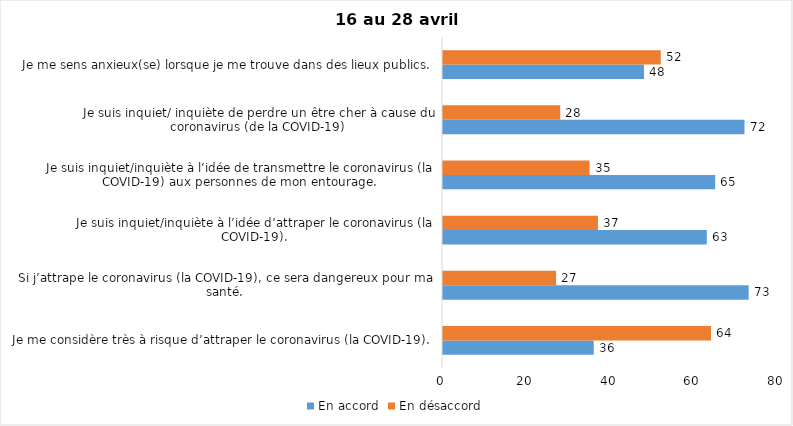
| Category | En accord | En désaccord |
|---|---|---|
| Je me considère très à risque d’attraper le coronavirus (la COVID-19). | 36 | 64 |
| Si j’attrape le coronavirus (la COVID-19), ce sera dangereux pour ma santé. | 73 | 27 |
| Je suis inquiet/inquiète à l’idée d’attraper le coronavirus (la COVID-19). | 63 | 37 |
| Je suis inquiet/inquiète à l’idée de transmettre le coronavirus (la COVID-19) aux personnes de mon entourage. | 65 | 35 |
| Je suis inquiet/ inquiète de perdre un être cher à cause du coronavirus (de la COVID-19) | 72 | 28 |
| Je me sens anxieux(se) lorsque je me trouve dans des lieux publics. | 48 | 52 |